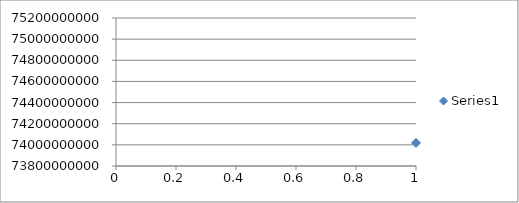
| Category | Series 0 |
|---|---|
| 0 | 74018188407.579 |
| 1 | 74984029513.814 |
| 2 | 74478231201.624 |
| 3 | 74196300599.996 |
| 4 | 74337207422.589 |